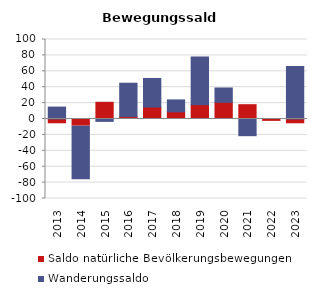
| Category | Saldo natürliche Bevölkerungsbewegungen | Wanderungssaldo |
|---|---|---|
| 2013.0 | -6 | 15 |
| 2014.0 | -9 | -66 |
| 2015.0 | 21 | -3 |
| 2016.0 | 3 | 42 |
| 2017.0 | 15 | 36 |
| 2018.0 | 9 | 15 |
| 2019.0 | 18 | 60 |
| 2020.0 | 21 | 18 |
| 2021.0 | 18 | -21 |
| 2022.0 | -3 | 0 |
| 2023.0 | -6 | 66 |